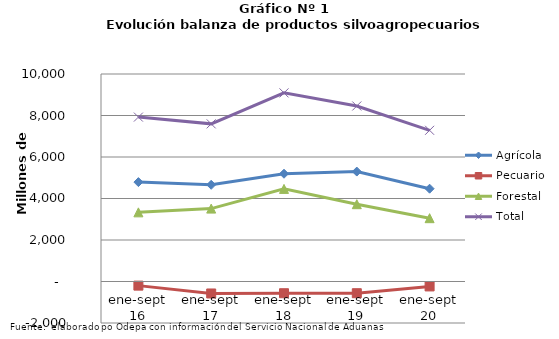
| Category | Agrícola | Pecuario | Forestal | Total |
|---|---|---|---|---|
| ene-sept 16 | 4790269 | -199050 | 3332472 | 7923691 |
| ene-sept 17 | 4661104 | -577501 | 3513486 | 7597089 |
| ene-sept 18 | 5193102 | -565487 | 4462457 | 9090072 |
| ene-sept 19 | 5297450 | -564227 | 3725339 | 8458562 |
| ene-sept 20 | 4472399 | -237517 | 3051676 | 7286558 |